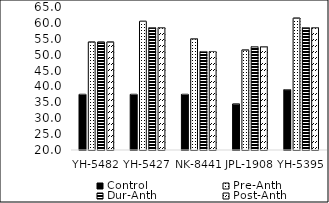
| Category | Control | Pre-Anth | Dur-Anth | Post-Anth |
|---|---|---|---|---|
| YH-5482 | 37.5 | 54 | 54 | 54 |
| YH-5427 | 37.5 | 60.5 | 58.5 | 58.5 |
| NK-8441 | 37.5 | 55 | 51 | 51 |
| JPL-1908 | 34.5 | 51.5 | 52.5 | 52.5 |
| YH-5395 | 39 | 61.5 | 58.5 | 58.5 |